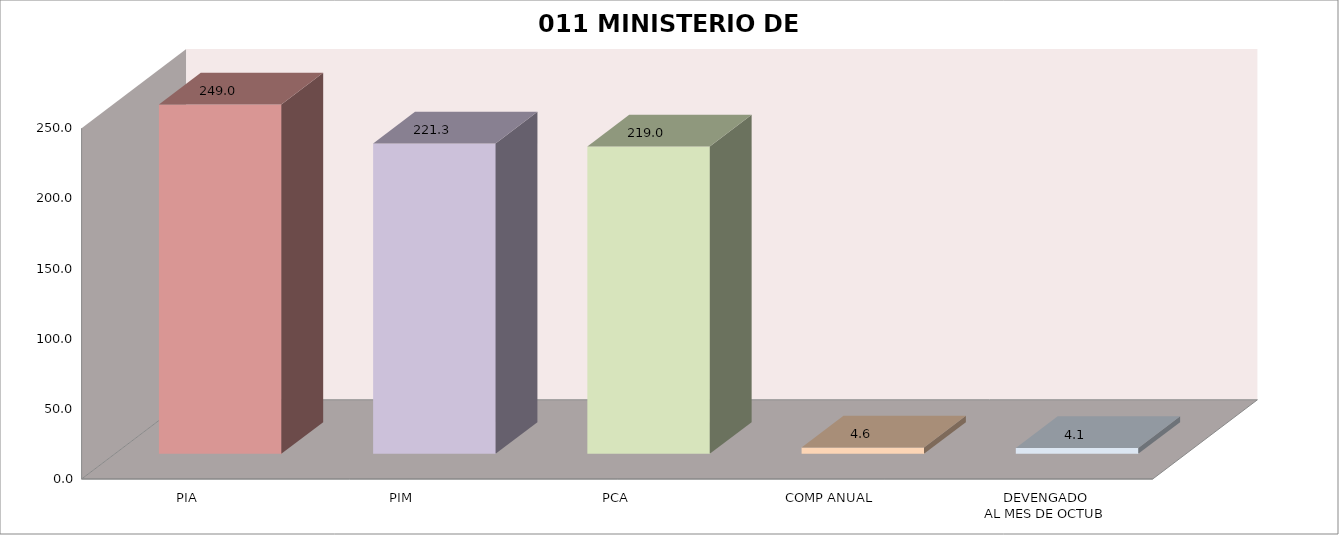
| Category | 011 MINISTERIO DE SALUD |
|---|---|
| PIA | 249.028 |
| PIM | 221.254 |
| PCA | 219.042 |
| COMP ANUAL | 4.562 |
| DEVENGADO
AL MES DE OCTUB | 4.129 |